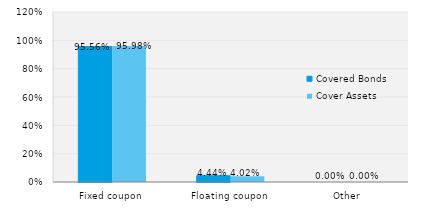
| Category | Covered Bonds | Cover Assets |
|---|---|---|
| Fixed coupon | 0.956 | 0.96 |
| Floating coupon | 0.044 | 0.04 |
| Other | 0 | 0 |